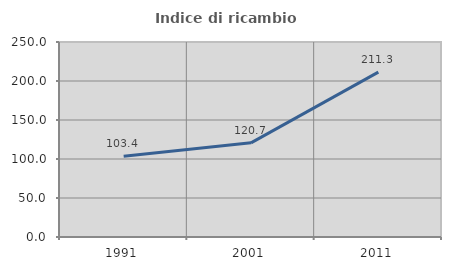
| Category | Indice di ricambio occupazionale  |
|---|---|
| 1991.0 | 103.431 |
| 2001.0 | 120.737 |
| 2011.0 | 211.31 |